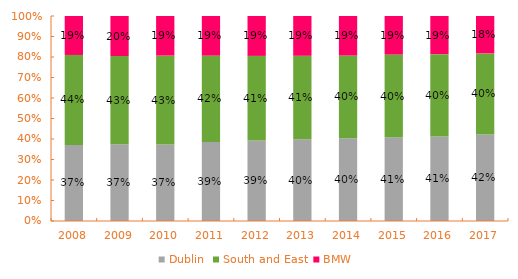
| Category | Dublin | South and East | BMW  |
|---|---|---|---|
| 2008.0 | 0.371 | 0.439 | 0.19 |
| 2009.0 | 0.375 | 0.43 | 0.195 |
| 2010.0 | 0.374 | 0.433 | 0.193 |
| 2011.0 | 0.385 | 0.421 | 0.193 |
| 2012.0 | 0.393 | 0.413 | 0.194 |
| 2013.0 | 0.399 | 0.407 | 0.194 |
| 2014.0 | 0.403 | 0.404 | 0.193 |
| 2015.0 | 0.407 | 0.405 | 0.188 |
| 2016.0 | 0.412 | 0.402 | 0.186 |
| 2017.0 | 0.422 | 0.396 | 0.183 |